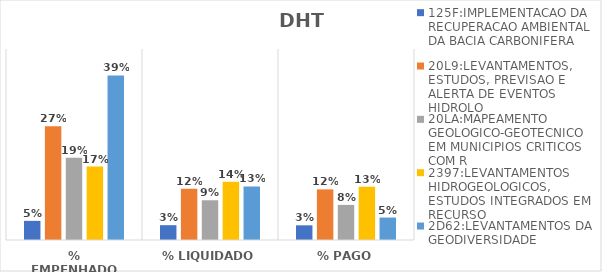
| Category | 125F:IMPLEMENTACAO DA RECUPERACAO AMBIENTAL DA BACIA CARBONIFERA | 20L9:LEVANTAMENTOS, ESTUDOS, PREVISAO E ALERTA DE EVENTOS HIDROLO | 20LA:MAPEAMENTO GEOLOGICO-GEOTECNICO EM MUNICIPIOS CRITICOS COM R | 2397:LEVANTAMENTOS HIDROGEOLOGICOS, ESTUDOS INTEGRADOS EM RECURSO | 2D62:LEVANTAMENTOS DA GEODIVERSIDADE |
|---|---|---|---|---|---|
| % EMPENHADO | 0.045 | 0.268 | 0.194 | 0.173 | 0.388 |
| % LIQUIDADO | 0.035 | 0.121 | 0.094 | 0.137 | 0.126 |
| % PAGO | 0.035 | 0.119 | 0.083 | 0.125 | 0.053 |